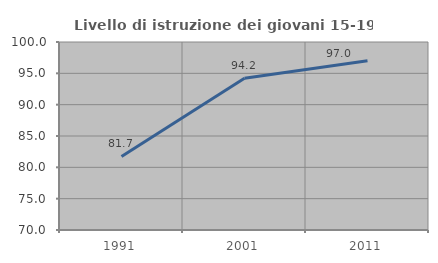
| Category | Livello di istruzione dei giovani 15-19 anni |
|---|---|
| 1991.0 | 81.738 |
| 2001.0 | 94.231 |
| 2011.0 | 96.997 |